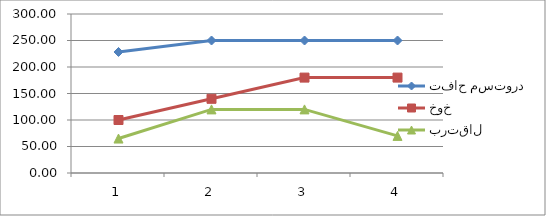
| Category | تفاح مستورد | خوخ | برتقال |
|---|---|---|---|
| 0 | 228.33 | 100 | 65 |
| 1 | 250 | 140 | 120 |
| 2 | 250 | 180 | 120 |
| 3 | 250 | 180 | 70 |